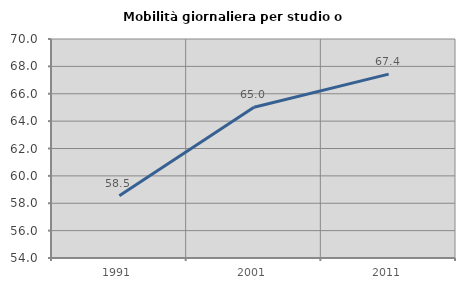
| Category | Mobilità giornaliera per studio o lavoro |
|---|---|
| 1991.0 | 58.542 |
| 2001.0 | 65.017 |
| 2011.0 | 67.434 |